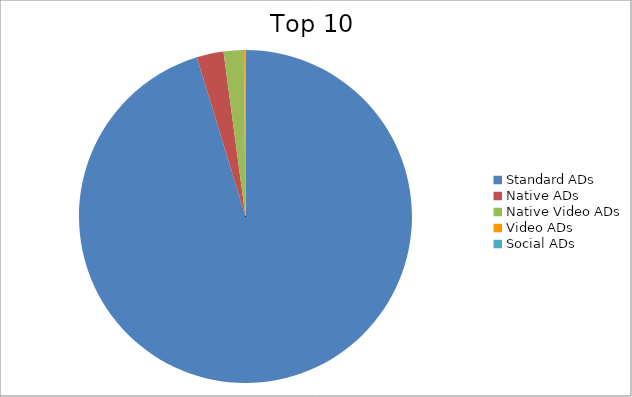
| Category | Series 0 |
|---|---|
| Standard ADs | 95.28 |
| Native ADs | 2.61 |
| Native Video ADs | 1.97 |
| Video ADs | 0.12 |
| Social ADs | 0.02 |